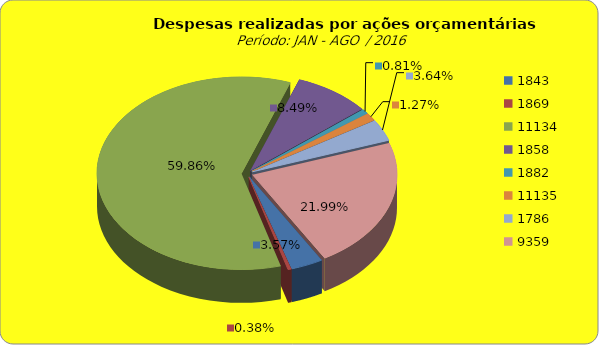
| Category | Series 1 |
|---|---|
| 1843.0 | 5874074.72 |
| 1869.0 | 633123.27 |
| 11134.0 | 98569763.74 |
| 1858.0 | 13973867.69 |
| 1882.0 | 1326303.92 |
| 11135.0 | 2090021.29 |
| 1786.0 | 5990786.79 |
| 9359.0 | 36205603.5 |